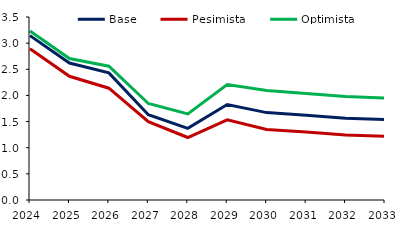
| Category | Base | Pesimista | Optimista |
|---|---|---|---|
| 2024.0 | 3.143 | 2.894 | 3.233 |
| 2025.0 | 2.62 | 2.366 | 2.707 |
| 2026.0 | 2.431 | 2.138 | 2.559 |
| 2027.0 | 1.631 | 1.499 | 1.846 |
| 2028.0 | 1.369 | 1.195 | 1.646 |
| 2029.0 | 1.827 | 1.533 | 2.207 |
| 2030.0 | 1.672 | 1.347 | 2.092 |
| 2031.0 | 1.621 | 1.298 | 2.039 |
| 2032.0 | 1.565 | 1.243 | 1.98 |
| 2033.0 | 1.538 | 1.218 | 1.949 |